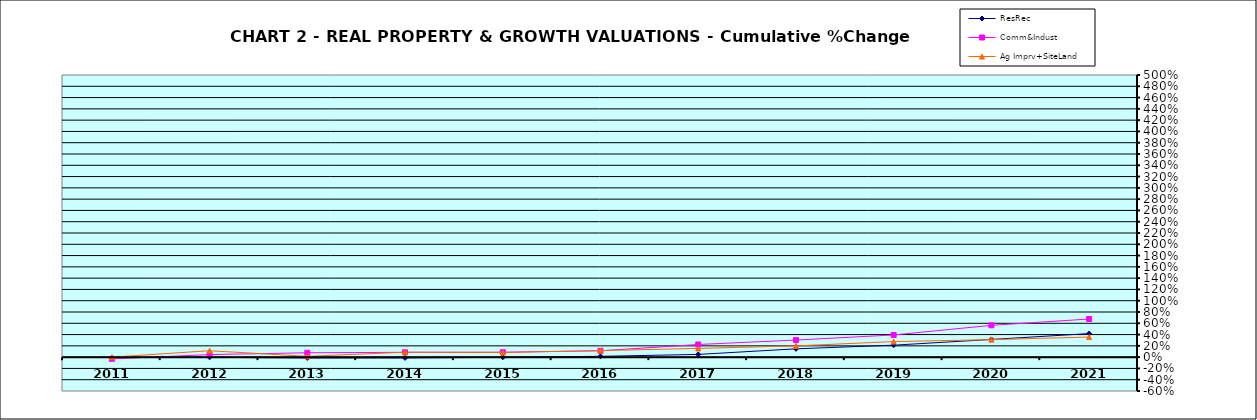
| Category | ResRec | Comm&Indust | Ag Imprv+SiteLand |
|---|---|---|---|
| 2011.0 | -0.008 | -0.03 | 0 |
| 2012.0 | -0.003 | 0.045 | 0.114 |
| 2013.0 | -0.014 | 0.078 | 0.014 |
| 2014.0 | -0.014 | 0.085 | 0.087 |
| 2015.0 | -0.002 | 0.088 | 0.082 |
| 2016.0 | 0.014 | 0.113 | 0.116 |
| 2017.0 | 0.048 | 0.224 | 0.155 |
| 2018.0 | 0.148 | 0.303 | 0.2 |
| 2019.0 | 0.212 | 0.393 | 0.276 |
| 2020.0 | 0.314 | 0.564 | 0.31 |
| 2021.0 | 0.417 | 0.676 | 0.356 |